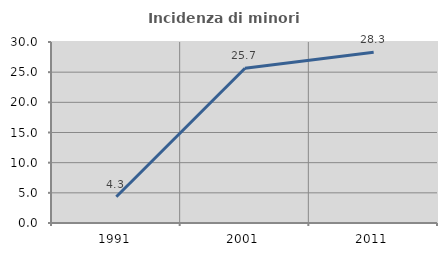
| Category | Incidenza di minori stranieri |
|---|---|
| 1991.0 | 4.348 |
| 2001.0 | 25.651 |
| 2011.0 | 28.316 |